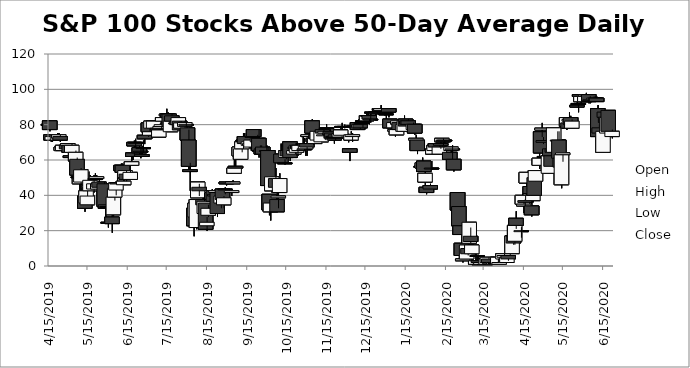
| Category | Open | High | Low | Close |
|---|---|---|---|---|
| 4/15/19 | 80.19 | 81.18 | 79.2 | 80.19 |
| 4/16/19 | 82.17 | 82.17 | 76.23 | 77.22 |
| 4/17/19 | 74.25 | 74.25 | 70.29 | 71.28 |
| 4/18/19 | 71.28 | 74.25 | 70.29 | 73.26 |
| 4/22/19 | 71.28 | 75.24 | 71.28 | 74.25 |
| 4/23/19 | 72.27 | 75.24 | 72.27 | 74.25 |
| 4/24/19 | 73.26 | 74.25 | 70.29 | 71.28 |
| 4/25/19 | 65.34 | 67.32 | 65.34 | 67.32 |
| 4/26/19 | 65.34 | 68.31 | 64.35 | 68.31 |
| 4/29/19 | 68.31 | 68.31 | 64.35 | 66.33 |
| 4/30/19 | 68.31 | 69.3 | 64.35 | 69.3 |
| 5/1/19 | 68.31 | 68.31 | 64.35 | 64.35 |
| 5/2/19 | 62.37 | 64.35 | 60.39 | 61.38 |
| 5/3/19 | 64.35 | 69.3 | 63.36 | 68.31 |
| 5/6/19 | 59.4 | 65.34 | 59.4 | 64.35 |
| 5/7/19 | 60.39 | 61.38 | 50.49 | 51.48 |
| 5/8/19 | 50.49 | 53.46 | 50.49 | 50.49 |
| 5/9/19 | 46.53 | 51.48 | 40.59 | 49.5 |
| 5/10/19 | 47.52 | 55.44 | 37.62 | 54.45 |
| 5/13/19 | 39.6 | 39.6 | 30.69 | 32.67 |
| 5/14/19 | 35.64 | 45.54 | 35.64 | 42.57 |
| 5/15/19 | 34.65 | 44.55 | 34.65 | 39.6 |
| 5/16/19 | 44.55 | 53.46 | 44.55 | 45.54 |
| 5/17/19 | 42.57 | 51.48 | 42.57 | 48.51 |
| 5/20/19 | 43.56 | 51.48 | 41.58 | 46.53 |
| 5/21/19 | 49.5 | 52.47 | 48.51 | 49.5 |
| 5/22/19 | 49.5 | 51.48 | 49.5 | 50.49 |
| 5/23/19 | 43.56 | 46.53 | 40.59 | 46.53 |
| 5/24/19 | 47.52 | 48.51 | 44.55 | 44.55 |
| 5/28/19 | 46.53 | 47.52 | 33.66 | 33.66 |
| 5/29/19 | 34.65 | 34.65 | 26.73 | 32.67 |
| 5/30/19 | 33.66 | 35.64 | 30.69 | 33.66 |
| 5/31/19 | 24.75 | 27.72 | 21.78 | 24.75 |
| 6/3/19 | 27.72 | 28.71 | 18.81 | 24 |
| 6/4/19 | 29 | 39 | 28 | 39 |
| 6/5/19 | 39 | 44 | 37 | 44 |
| 6/6/19 | 43 | 48 | 40 | 47 |
| 6/7/19 | 47 | 52 | 47 | 47 |
| 6/10/19 | 57 | 58 | 53 | 54 |
| 6/11/19 | 57 | 58 | 49 | 53 |
| 6/12/19 | 46 | 52 | 46 | 48 |
| 6/13/19 | 50 | 54 | 50 | 54 |
| 6/14/19 | 52 | 54 | 48 | 49 |
| 6/17/19 | 49 | 57 | 49 | 53 |
| 6/18/19 | 57 | 64 | 57 | 59 |
| 6/19/19 | 64 | 66 | 60 | 62 |
| 6/20/19 | 70 | 71 | 62 | 68 |
| 6/21/19 | 70 | 72 | 66 | 70 |
| 6/24/19 | 67 | 68 | 63 | 64 |
| 6/25/19 | 65 | 67 | 61 | 65 |
| 6/26/19 | 63 | 68 | 62 | 62 |
| 6/27/19 | 67 | 71 | 64 | 67 |
| 6/28/19 | 74 | 75 | 69 | 72 |
| 7/1/19 | 81 | 81 | 73 | 76 |
| 7/2/19 | 74 | 79 | 74 | 76 |
| 7/3/19 | 78 | 82 | 77 | 82 |
| 7/5/19 | 78 | 82 | 75 | 82 |
| 7/8/19 | 78 | 78 | 75 | 77 |
| 7/9/19 | 73 | 78 | 73 | 77 |
| 7/10/19 | 78 | 81 | 77 | 79 |
| 7/11/19 | 79 | 84 | 77 | 80 |
| 7/12/19 | 82 | 85 | 82 | 84 |
| 7/15/19 | 85 | 89 | 82 | 86 |
| 7/16/19 | 86 | 87 | 84 | 84 |
| 7/17/19 | 86 | 86 | 79 | 79 |
| 7/18/19 | 76 | 83 | 76 | 82 |
| 7/19/19 | 85 | 86 | 82 | 82 |
| 7/22/19 | 81 | 82 | 77 | 81 |
| 7/23/19 | 82 | 83 | 79 | 80 |
| 7/24/19 | 80 | 84 | 80 | 84 |
| 7/25/19 | 82 | 82 | 77 | 77 |
| 7/26/19 | 78 | 82 | 76 | 81 |
| 7/29/19 | 79 | 82.17 | 77 | 81.18 |
| 7/30/19 | 80.19 | 82.17 | 76.23 | 80.19 |
| 7/31/19 | 78.21 | 79.2 | 70.29 | 71.28 |
| 8/1/19 | 71.28 | 77.22 | 53.46 | 56.43 |
| 8/2/19 | 54.45 | 58.41 | 42.57 | 53.46 |
| 8/5/19 | 32.67 | 32.67 | 16.83 | 22.77 |
| 8/6/19 | 27.72 | 35.64 | 22.77 | 35.64 |
| 8/7/19 | 21.78 | 37.62 | 20.79 | 37.62 |
| 8/8/19 | 38.61 | 47.52 | 38.61 | 47.52 |
| 8/9/19 | 44.55 | 46.53 | 39.6 | 42.57 |
| 8/12/19 | 37.62 | 38.61 | 33.66 | 34.65 |
| 8/13/19 | 29.7 | 41.58 | 29.7 | 36.63 |
| 8/14/19 | 35.64 | 35.64 | 20.79 | 20.79 |
| 8/15/19 | 22.77 | 27.72 | 19.8 | 24.75 |
| 8/16/19 | 28.71 | 34.65 | 27.72 | 32.67 |
| 8/19/19 | 41.58 | 43.56 | 40.59 | 42.57 |
| 8/20/19 | 42.57 | 42.57 | 36.63 | 36.63 |
| 8/21/19 | 40.59 | 40.59 | 38.61 | 39.6 |
| 8/22/19 | 41.58 | 42.57 | 37.62 | 42.57 |
| 8/23/19 | 41.58 | 42.57 | 27.72 | 29.7 |
| 8/26/19 | 35.64 | 39.6 | 32.67 | 39.6 |
| 8/27/19 | 43.56 | 43.56 | 34.65 | 37.62 |
| 8/28/19 | 34.65 | 39.6 | 32.67 | 38.61 |
| 8/29/19 | 43.56 | 44.55 | 40.59 | 43.56 |
| 8/30/19 | 47.52 | 47.52 | 45.54 | 46.53 |
| 9/3/19 | 41.58 | 43.56 | 39.6 | 42.57 |
| 9/4/19 | 46.53 | 48.51 | 46.53 | 47.52 |
| 9/5/19 | 52.47 | 60.39 | 52.47 | 55.44 |
| 9/6/19 | 56.43 | 61.38 | 55.44 | 55.44 |
| 9/9/19 | 62.37 | 70.29 | 61.38 | 67.32 |
| 9/10/19 | 60.39 | 66.33 | 60.39 | 66.33 |
| 9/11/19 | 66.33 | 70.29 | 64.35 | 70.29 |
| 9/12/19 | 71.28 | 75.24 | 66.33 | 71.28 |
| 9/13/19 | 73.26 | 75.24 | 68.31 | 69.3 |
| 9/16/19 | 68.31 | 71.28 | 68.31 | 70.29 |
| 9/17/19 | 68.31 | 70.29 | 66.33 | 69.3 |
| 9/18/19 | 67.32 | 71.28 | 65.34 | 71.28 |
| 9/19/19 | 73.26 | 77.22 | 72.27 | 73.26 |
| 9/20/19 | 77.22 | 77.22 | 73.26 | 73.26 |
| 9/23/19 | 70.29 | 74.25 | 69.3 | 72.27 |
| 9/24/19 | 72.27 | 77.22 | 61.38 | 65.34 |
| 9/25/19 | 65.34 | 68.31 | 64.35 | 65.34 |
| 9/26/19 | 66.33 | 68.31 | 59.4 | 63.36 |
| 9/27/19 | 67.32 | 67.32 | 58.41 | 63.36 |
| 9/30/19 | 65.34 | 68.31 | 64.35 | 65.34 |
| 10/1/19 | 65.34 | 67.32 | 45.54 | 45.54 |
| 10/2/19 | 40.59 | 40.59 | 28.71 | 31.68 |
| 10/3/19 | 30.69 | 36.63 | 25.74 | 35.64 |
| 10/4/19 | 42.57 | 50.49 | 41.58 | 50.49 |
| 10/7/19 | 49.5 | 55.44 | 44.55 | 44.55 |
| 10/8/19 | 37.62 | 41.58 | 30.69 | 30.69 |
| 10/9/19 | 38.61 | 43.56 | 32.67 | 39.6 |
| 10/10/19 | 41.58 | 52.47 | 41.58 | 49.5 |
| 10/11/19 | 63.36 | 69.3 | 58.41 | 58.41 |
| 10/14/19 | 58.41 | 60.39 | 57.42 | 58.41 |
| 10/15/19 | 61.38 | 70.29 | 60.39 | 65.34 |
| 10/16/19 | 65.34 | 68.31 | 62.37 | 62.37 |
| 10/17/19 | 68.31 | 68.31 | 65.34 | 68.31 |
| 10/18/19 | 70.29 | 70.29 | 59.4 | 61.38 |
| 10/21/19 | 63.36 | 66.33 | 63.36 | 65.34 |
| 10/22/19 | 67.32 | 68.31 | 63.36 | 66.33 |
| 10/23/19 | 64.35 | 68.31 | 62.37 | 68.31 |
| 10/24/19 | 68.31 | 68.31 | 62.37 | 66.33 |
| 10/25/19 | 65.34 | 68.31 | 65.34 | 68.31 |
| 10/28/19 | 69.3 | 73.26 | 67.32 | 69.3 |
| 10/29/19 | 66.33 | 72.27 | 65.34 | 66.33 |
| 10/30/19 | 66.33 | 69.3 | 62.37 | 69.3 |
| 10/31/19 | 69.3 | 69.3 | 62.37 | 67.32 |
| 11/1/19 | 73.26 | 75.24 | 72.27 | 74.25 |
| 11/4/19 | 82.17 | 83.16 | 72.27 | 75.24 |
| 11/5/19 | 72.27 | 73.26 | 68.31 | 70.29 |
| 11/6/19 | 69.3 | 73.26 | 69.3 | 72.27 |
| 11/7/19 | 74.25 | 74.25 | 71.28 | 72.27 |
| 11/8/19 | 71.28 | 76.23 | 71.28 | 76.23 |
| 11/11/19 | 70.29 | 76.23 | 70.29 | 76.23 |
| 11/12/19 | 77.22 | 78.21 | 74.25 | 75.24 |
| 11/13/19 | 74.25 | 77.22 | 72.27 | 74.25 |
| 11/14/19 | 75.24 | 76.23 | 71.28 | 76.23 |
| 11/15/19 | 78.21 | 80.19 | 78.21 | 78.21 |
| 11/18/19 | 76.23 | 77.22 | 73.26 | 74.25 |
| 11/19/19 | 75.24 | 75.24 | 72.27 | 72.27 |
| 11/20/19 | 73.26 | 73.26 | 71.28 | 73.26 |
| 11/21/19 | 72.27 | 74.25 | 69.3 | 71.28 |
| 11/22/19 | 74.25 | 75.24 | 71.28 | 73 |
| 11/25/19 | 73 | 76 | 73 | 75 |
| 11/26/19 | 74 | 78 | 74 | 77 |
| 11/27/19 | 79 | 81 | 77 | 79 |
| 11/29/19 | 79 | 80 | 78 | 79 |
| 12/2/19 | 73 | 75 | 70 | 72.54 |
| 12/3/19 | 66.33 | 66.33 | 59.4 | 64.35 |
| 12/4/19 | 71.28 | 76.23 | 71.28 | 74.25 |
| 12/5/19 | 73.26 | 75.24 | 70.29 | 74.25 |
| 12/6/19 | 79.2 | 80.19 | 79.2 | 79.2 |
| 12/9/19 | 81.18 | 81.18 | 77.22 | 77.22 |
| 12/10/19 | 78.21 | 83.16 | 78.21 | 80.19 |
| 12/11/19 | 80.19 | 81.18 | 77.22 | 78.21 |
| 12/12/19 | 81.18 | 82.17 | 80.19 | 81.18 |
| 12/13/19 | 82.17 | 83.16 | 78.21 | 82.17 |
| 12/16/19 | 82.17 | 86.13 | 82.17 | 85.14 |
| 12/17/19 | 85.14 | 86.13 | 84.15 | 85.14 |
| 12/18/19 | 85.14 | 85.14 | 80.19 | 83.16 |
| 12/19/19 | 83.16 | 86.13 | 81.18 | 83.16 |
| 12/20/19 | 87.12 | 87.12 | 87.12 | 87.12 |
| 12/23/19 | 87.12 | 88.11 | 85.14 | 86.13 |
| 12/24/19 | 87.12 | 89.1 | 86.13 | 87.12 |
| 12/26/19 | 89.1 | 89.1 | 86.13 | 88.11 |
| 12/27/19 | 88.11 | 91.08 | 87.12 | 89.1 |
| 12/30/19 | 87.12 | 87.12 | 85.14 | 87.12 |
| 12/31/19 | 86.13 | 87.12 | 83.16 | 86.13 |
| 1/2/20 | 89.1 | 89.1 | 84.15 | 87.12 |
| 1/3/20 | 83.16 | 83.16 | 78.21 | 78.21 |
| 1/6/20 | 78.21 | 81.18 | 77.22 | 81.18 |
| 1/7/20 | 76.23 | 79.2 | 73.26 | 77.22 |
| 1/8/20 | 74.25 | 80.19 | 74.25 | 77.22 |
| 1/9/20 | 80.19 | 83.16 | 80.19 | 82.17 |
| 1/10/20 | 81.18 | 83.16 | 77.22 | 77.22 |
| 1/13/20 | 76.23 | 81.18 | 76.23 | 80.19 |
| 1/14/20 | 76.23 | 85.14 | 76.23 | 82.17 |
| 1/15/20 | 83.16 | 83.16 | 79.2 | 79.2 |
| 1/16/20 | 82.17 | 82.17 | 80.19 | 80.19 |
| 1/17/20 | 82.17 | 83.16 | 79.2 | 80.19 |
| 1/21/20 | 77.22 | 81.18 | 76.23 | 80.19 |
| 1/22/20 | 80.19 | 80.19 | 74.25 | 75.24 |
| 1/23/20 | 71.28 | 74.25 | 69.3 | 72.27 |
| 1/24/20 | 71.28 | 71.28 | 63.36 | 65.34 |
| 1/27/20 | 56.43 | 58.41 | 55.44 | 56.43 |
| 1/28/20 | 55.44 | 61.38 | 55.44 | 58.41 |
| 1/29/20 | 59.4 | 59.4 | 53.46 | 53.46 |
| 1/30/20 | 47.52 | 53.46 | 43.56 | 52.47 |
| 1/31/20 | 44.55 | 44.55 | 40.59 | 41.58 |
| 2/3/20 | 45.54 | 46.53 | 43.56 | 43.56 |
| 2/4/20 | 55.44 | 59.4 | 54.45 | 55.44 |
| 2/5/20 | 63.36 | 67.32 | 63.36 | 66.33 |
| 2/6/20 | 65.34 | 69.3 | 65.34 | 68.31 |
| 2/7/20 | 69.3 | 69.3 | 67.32 | 67.32 |
| 2/10/20 | 63.36 | 68.31 | 63.36 | 67.32 |
| 2/11/20 | 69.3 | 71.28 | 66.33 | 68.31 |
| 2/12/20 | 70.29 | 72.27 | 70.29 | 72.27 |
| 2/13/20 | 71.28 | 72.27 | 68.31 | 70.29 |
| 2/14/20 | 71.28 | 71.28 | 69.3 | 71.28 |
| 2/18/20 | 64.35 | 64.35 | 58.41 | 60.39 |
| 2/19/20 | 65.34 | 67.32 | 64.35 | 67.32 |
| 2/20/20 | 66.33 | 68.31 | 60.39 | 66.33 |
| 2/21/20 | 60.39 | 60.39 | 53.46 | 54.45 |
| 2/24/20 | 41.58 | 41.58 | 31.68 | 31.68 |
| 2/25/20 | 33.66 | 33.66 | 20.79 | 22.77 |
| 2/26/20 | 22.77 | 22.77 | 17.82 | 17.82 |
| 2/27/20 | 12.87 | 14.85 | 5.94 | 5.94 |
| 2/28/20 | 2.97 | 4.95 | 1.98 | 3.96 |
| 3/2/20 | 3.96 | 11.88 | 3.96 | 11.88 |
| 3/3/20 | 9.9 | 17.82 | 5.94 | 6.93 |
| 3/4/20 | 12.87 | 24.75 | 11.88 | 24.75 |
| 3/5/20 | 16.83 | 21.78 | 12.87 | 13.86 |
| 3/6/20 | 6.93 | 11.88 | 5.94 | 11.88 |
| 3/9/20 | 0.99 | 6.93 | 0.99 | 2.97 |
| 3/10/20 | 5.94 | 5.94 | 0.99 | 5.94 |
| 3/11/20 | 2.97 | 4.95 | 0.99 | 1.98 |
| 3/12/20 | 0.99 | 0.99 | 0.99 | 0.99 |
| 3/13/20 | 0.99 | 1.98 | 0.01 | 1.98 |
| 3/16/20 | 0.99 | 1.98 | 0.01 | 0.99 |
| 3/17/20 | 0.99 | 4.95 | 0.99 | 3.96 |
| 3/18/20 | 1.98 | 4.95 | 1.98 | 4.95 |
| 3/19/20 | 3.96 | 4.95 | 1.98 | 1.98 |
| 3/20/20 | 1.98 | 1.98 | 0.99 | 0.99 |
| 3/23/20 | 0.99 | 2.97 | 0.99 | 1.98 |
| 3/24/20 | 1.98 | 2.97 | 0.99 | 1.98 |
| 3/25/20 | 1.98 | 1.98 | 0.99 | 0.99 |
| 3/26/20 | 0.99 | 4.95 | 0.99 | 4.95 |
| 3/27/20 | 0.99 | 4.95 | 0.99 | 1.98 |
| 3/30/20 | 3.96 | 6.93 | 3.96 | 6.93 |
| 3/31/20 | 4.95 | 6.93 | 4.95 | 5.94 |
| 4/1/20 | 3.96 | 4.95 | 1.98 | 1.98 |
| 4/2/20 | 1.98 | 4.95 | 1.98 | 4.95 |
| 4/3/20 | 5.94 | 5.94 | 2.97 | 4 |
| 4/6/20 | 7 | 17 | 7 | 17 |
| 4/7/20 | 17 | 23 | 12 | 13 |
| 4/8/20 | 14 | 25 | 12 | 23 |
| 4/9/20 | 27 | 31 | 21 | 23 |
| 4/13/20 | 20 | 22 | 16 | 20 |
| 4/14/20 | 35 | 41 | 35 | 40 |
| 4/15/20 | 34 | 37 | 30 | 35 |
| 4/16/20 | 37 | 38 | 34 | 36 |
| 4/17/20 | 47 | 53 | 40 | 53 |
| 4/20/20 | 45 | 48 | 41 | 41 |
| 4/21/20 | 34 | 37 | 28 | 29 |
| 4/22/20 | 37 | 44 | 36 | 40 |
| 4/23/20 | 50 | 51 | 40 | 40 |
| 4/24/20 | 48 | 54 | 48 | 54 |
| 4/27/20 | 57 | 64 | 55 | 61 |
| 4/28/20 | 76 | 76 | 64 | 64 |
| 4/29/20 | 77 | 81 | 73 | 78 |
| 4/30/20 | 71 | 73 | 69 | 70 |
| 5/1/20 | 62 | 64 | 59 | 62 |
| 5/4/20 | 52.47 | 62.37 | 52.47 | 62.37 |
| 5/5/20 | 66.33 | 67.32 | 62.37 | 62.37 |
| 5/6/20 | 62.37 | 62.37 | 56.43 | 56.43 |
| 5/7/20 | 66.33 | 69.3 | 62.37 | 64.35 |
| 5/8/20 | 64.35 | 78.21 | 64.35 | 78.21 |
| 5/11/20 | 71.28 | 76.23 | 68.31 | 71.28 |
| 5/12/20 | 71.28 | 76.23 | 61 | 61 |
| 5/13/20 | 61 | 63 | 52 | 56 |
| 5/14/20 | 46 | 63 | 44 | 63 |
| 5/15/20 | 63 | 64 | 59 | 64 |
| 5/18/20 | 79 | 84 | 77 | 84 |
| 5/19/20 | 81 | 83 | 78 | 78 |
| 5/20/20 | 82 | 87 | 81 | 83 |
| 5/21/20 | 84 | 85 | 79 | 80 |
| 5/22/20 | 78 | 83 | 78 | 82 |
| 5/26/20 | 91 | 93 | 90 | 90 |
| 5/27/20 | 92 | 92 | 87 | 92 |
| 5/28/20 | 97 | 97 | 95 | 96 |
| 5/29/20 | 93 | 96 | 91 | 96 |
| 6/1/20 | 93 | 97 | 93 | 96 |
| 6/2/20 | 96 | 98 | 95 | 97.02 |
| 6/3/20 | 96.03 | 97.02 | 95.04 | 97.02 |
| 6/4/20 | 97.02 | 97.02 | 92.07 | 93.06 |
| 6/5/20 | 94.05 | 96.03 | 92.07 | 94.05 |
| 6/8/20 | 94.05 | 96.03 | 93.06 | 95.04 |
| 6/9/20 | 95.04 | 96.03 | 93.06 | 94.05 |
| 6/10/20 | 95.04 | 96.03 | 93.06 | 93.06 |
| 6/11/20 | 89.1 | 91.08 | 73.26 | 73.26 |
| 6/12/20 | 78.21 | 80.19 | 67.32 | 75.24 |
| 6/15/20 | 64.35 | 78.21 | 64.35 | 76.23 |
| 6/16/20 | 87.12 | 88.11 | 81.18 | 84.15 |
| 6/17/20 | 84.15 | 86.13 | 80.19 | 81.18 |
| 6/18/20 | 75.24 | 84.15 | 75.24 | 84.15 |
| 6/19/20 | 88.11 | 88.11 | 75.24 | 76.23 |
| 6/22/20 | 73.26 | 77.22 | 72.27 | 76.23 |